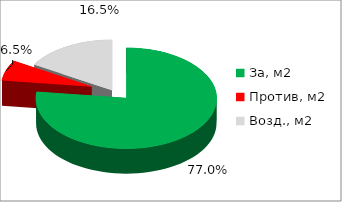
| Category | Series 0 |
|---|---|
| За, м2 | 0.77 |
| Против, м2 | 0.065 |
| Возд., м2 | 0.165 |